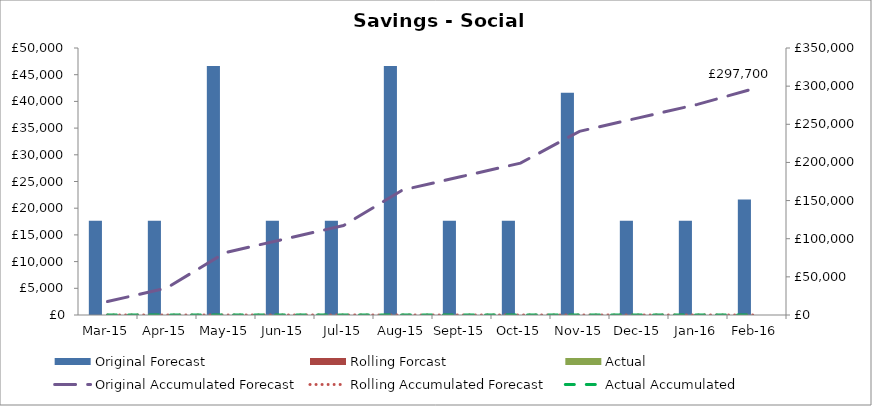
| Category | Original Forecast | Rolling Forcast | Actual |
|---|---|---|---|
| 2015-03-01 | 17641.65 | 0 | 0 |
| 2015-04-01 | 17641.65 | 0 | 0 |
| 2015-05-01 | 46641.65 | 0 | 0 |
| 2015-06-01 | 17641.65 | 0 | 0 |
| 2015-07-01 | 17641.65 | 0 | 0 |
| 2015-08-01 | 46641.65 | 0 | 0 |
| 2015-09-01 | 17641.65 | 0 | 0 |
| 2015-10-01 | 17641.65 | 0 | 0 |
| 2015-11-01 | 41641.65 | 0 | 0 |
| 2015-12-01 | 17641.65 | 0 | 0 |
| 2016-01-01 | 17641.65 | 0 | 0 |
| 2016-02-01 | 21641.65 | 0 | 0 |